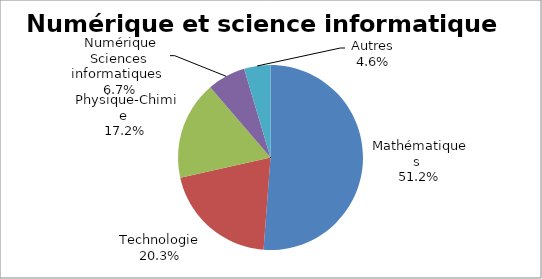
| Category | Numérique et science informatique |
|---|---|
| Mathématiques | 0.512 |
| Technologie | 0.203 |
| Physique-Chimie | 0.172 |
| Numérique Sciences informatiques | 0.067 |
| Autres | 0.046 |